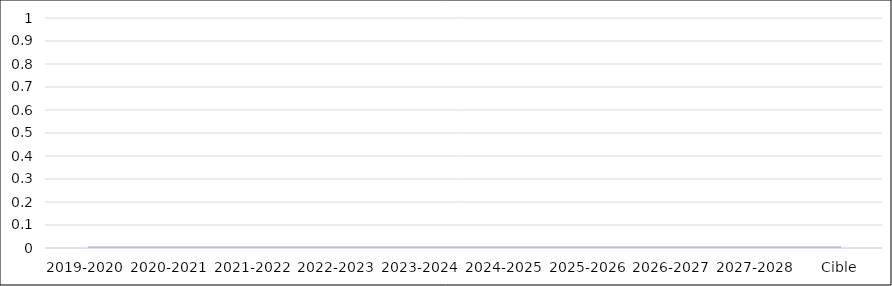
| Category | Series 0 |
|---|---|
| 2019-2020 | 0 |
| 2020-2021 | 0 |
| 2021-2022 | 0 |
| 2022-2023 | 0 |
| 2023-2024 | 0 |
| 2024-2025 | 0 |
| 2025-2026 | 0 |
| 2026-2027 | 0 |
| 2027-2028 | 0 |
| Cible | 0 |